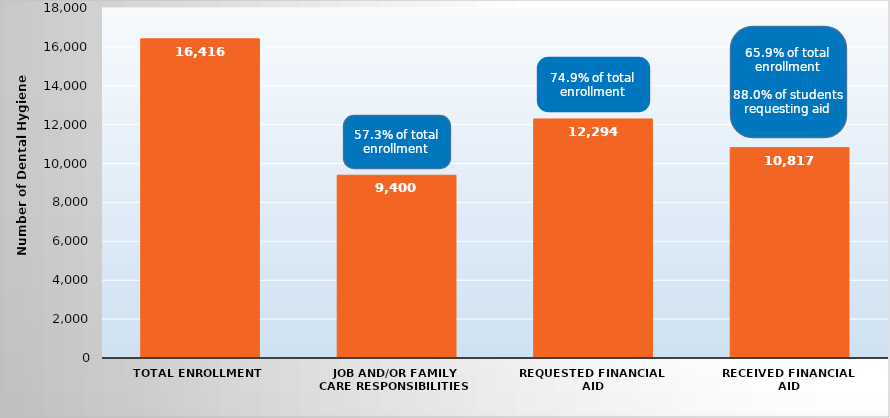
| Category | Number of Dental Hygiene Students |
|---|---|
| Total Enrollment | 16416 |
| Job and/or Family Care Responsibilities | 9400 |
| Requested Financial Aid | 12294 |
| Received Financial Aid | 10817 |